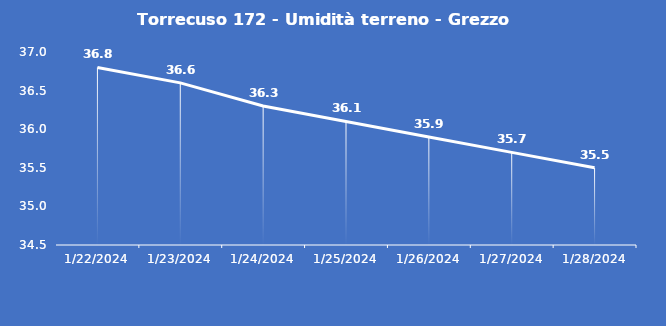
| Category | Torrecuso 172 - Umidità terreno - Grezzo (%VWC) |
|---|---|
| 1/22/24 | 36.8 |
| 1/23/24 | 36.6 |
| 1/24/24 | 36.3 |
| 1/25/24 | 36.1 |
| 1/26/24 | 35.9 |
| 1/27/24 | 35.7 |
| 1/28/24 | 35.5 |